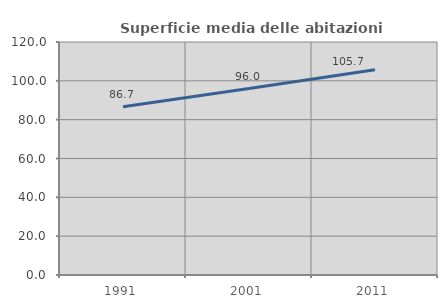
| Category | Superficie media delle abitazioni occupate |
|---|---|
| 1991.0 | 86.675 |
| 2001.0 | 96.05 |
| 2011.0 | 105.713 |